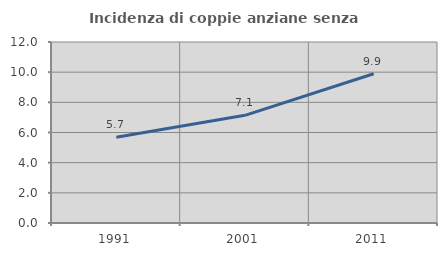
| Category | Incidenza di coppie anziane senza figli  |
|---|---|
| 1991.0 | 5.69 |
| 2001.0 | 7.139 |
| 2011.0 | 9.892 |